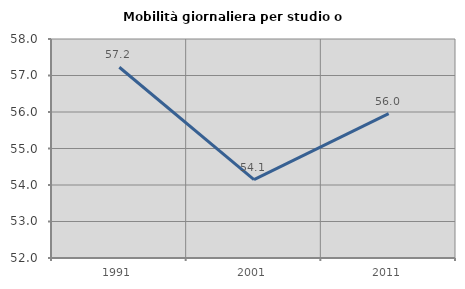
| Category | Mobilità giornaliera per studio o lavoro |
|---|---|
| 1991.0 | 57.225 |
| 2001.0 | 54.146 |
| 2011.0 | 55.956 |